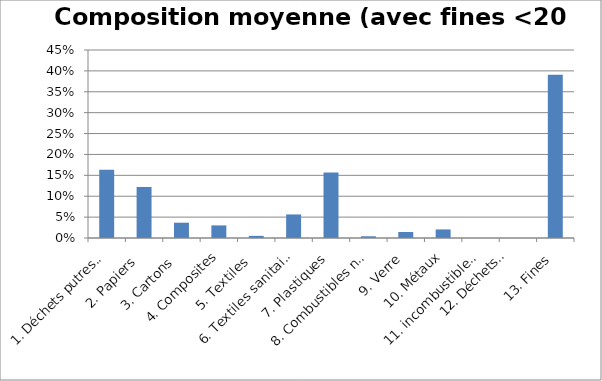
| Category | Composition moyenne (avec fines <20 mm) |
|---|---|
| 1. Déchets putrescibles | 0.163 |
| 2. Papiers  | 0.122 |
| 3. Cartons  | 0.037 |
| 4. Composites | 0.03 |
| 5. Textiles  | 0.005 |
| 6. Textiles sanitaires | 0.056 |
| 7. Plastiques | 0.156 |
| 8. Combustibles non classés | 0.004 |
| 9. Verre | 0.014 |
| 10. Métaux | 0.021 |
| 11. incombustibles non classés | 0 |
| 12. Déchets
 dangereux | 0 |
| 13. Fines | 0.391 |